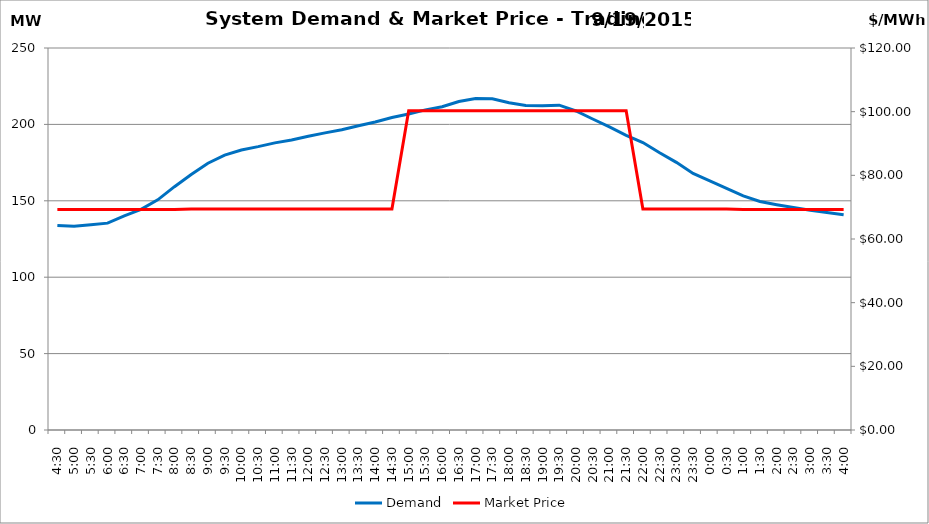
| Category | Demand |
|---|---|
| 0.1875 | 133.88 |
| 0.20833333333333334 | 133.27 |
| 0.22916666666666666 | 134.34 |
| 0.25 | 135.38 |
| 0.270833333333333 | 140.1 |
| 0.291666666666667 | 144.37 |
| 0.3125 | 150.64 |
| 0.333333333333333 | 159.25 |
| 0.354166666666667 | 167.21 |
| 0.375 | 174.58 |
| 0.395833333333333 | 179.92 |
| 0.416666666666667 | 183.28 |
| 0.4375 | 185.46 |
| 0.458333333333333 | 187.92 |
| 0.479166666666667 | 189.83 |
| 0.5 | 192.25 |
| 0.520833333333333 | 194.44 |
| 0.541666666666667 | 196.45 |
| 0.5625 | 199.15 |
| 0.583333333333333 | 201.54 |
| 0.604166666666667 | 204.47 |
| 0.625 | 206.76 |
| 0.645833333333334 | 209.52 |
| 0.666666666666667 | 211.53 |
| 0.6875 | 215.02 |
| 0.708333333333334 | 216.95 |
| 0.729166666666667 | 216.75 |
| 0.75 | 214.13 |
| 0.770833333333334 | 212.33 |
| 0.791666666666667 | 212.15 |
| 0.8125 | 212.58 |
| 0.833333333333334 | 208.78 |
| 0.854166666666667 | 203.54 |
| 0.875 | 198.32 |
| 0.895833333333334 | 192.82 |
| 0.916666666666667 | 188.12 |
| 0.9375 | 181.47 |
| 0.958333333333334 | 175.15 |
| 0.979166666666667 | 167.87 |
| 1900-01-01 | 163.1 |
| 1900-01-01 00:30:00 | 158.2 |
| 1900-01-01 01:00:00 | 153.24 |
| 1900-01-01 01:30:00 | 149.56 |
| 1900-01-01 02:00:00 | 147.46 |
| 1900-01-01 02:30:00 | 145.58 |
| 1900-01-01 03:00:00 | 143.78 |
| 1900-01-01 03:30:00 | 142.37 |
| 1900-01-01 04:00:00 | 140.84 |